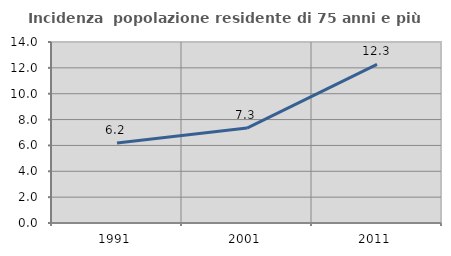
| Category | Incidenza  popolazione residente di 75 anni e più |
|---|---|
| 1991.0 | 6.184 |
| 2001.0 | 7.345 |
| 2011.0 | 12.265 |